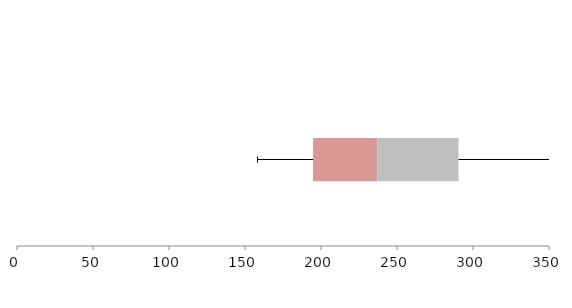
| Category | Series 1 | Series 2 | Series 3 |
|---|---|---|---|
| 0 | 194.8 | 42.327 | 53.334 |